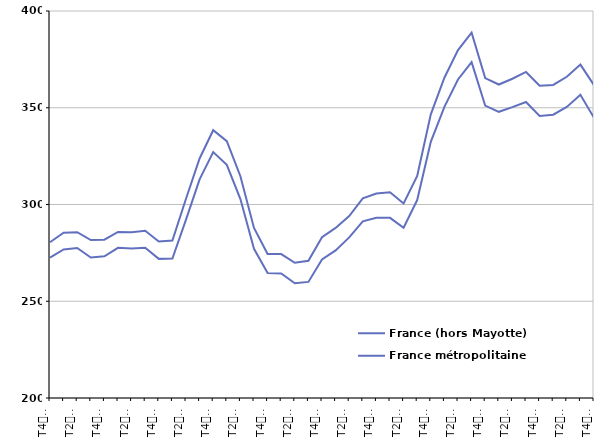
| Category | France (hors Mayotte) | France métropolitaine |
|---|---|---|
| T4
2013 | 280.5 | 272.5 |
| T1
2014 | 285.4 | 276.8 |
| T2
2014 | 285.7 | 277.5 |
| T3
2014 | 281.6 | 272.6 |
| T4
2014 | 281.8 | 273.2 |
| T1
2015 | 285.8 | 277.6 |
| T2
2015 | 285.7 | 277.3 |
| T3
2015 | 286.4 | 277.6 |
| T4
2015 | 280.9 | 271.9 |
| T1
2016 | 281.4 | 272.1 |
| T2
2016 | 303 | 292.2 |
| T3
2016 | 323.8 | 313 |
| T4
2016 | 338.4 | 327.1 |
| T1
2017 | 332.7 | 320.5 |
| T2
2017 | 314.6 | 302.8 |
| T3
2017 | 287.9 | 277.1 |
| T4
2017 | 274.4 | 264.6 |
| T1
2018 | 274.4 | 264.4 |
| T2
2018 | 269.9 | 259.3 |
| T3
2018 | 270.9 | 260 |
| T4
2018 | 283.1 | 271.6 |
| T1
2019 | 287.9 | 276.3 |
| T2
2019 | 294 | 283 |
| T3
2019 | 303.2 | 291.3 |
| T4
2019 | 305.7 | 293.1 |
| T1
2020 | 306.3 | 293.1 |
| T2
2020 | 300.5 | 288 |
| T3
2020 | 314.8 | 302.3 |
| T4
2020 | 346.6 | 332.4 |
| T1
2021 | 365.5 | 350.5 |
| T2
2021 | 379.8 | 364.6 |
| T3
2021 | 388.8 | 373.6 |
| T4
2021 | 365.3 | 351.1 |
| T1
2022 | 362 | 347.9 |
| T2
2022 | 365 | 350.3 |
| T3
2022 | 368.5 | 353 |
| T4
2022 | 361.4 | 345.8 |
| T1
2023 | 361.8 | 346.4 |
| T2
2023 | 366 | 350.4 |
| T3
2023 | 372.3 | 356.7 |
| T4
2023 | 361.7 | 344.8 |